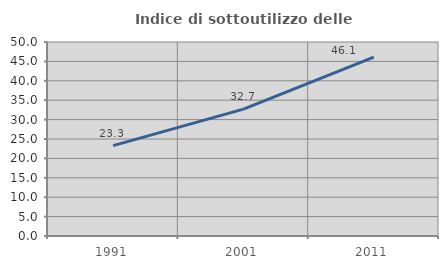
| Category | Indice di sottoutilizzo delle abitazioni  |
|---|---|
| 1991.0 | 23.285 |
| 2001.0 | 32.687 |
| 2011.0 | 46.102 |